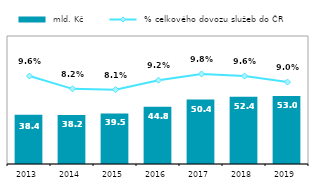
| Category |  mld. Kč |
|---|---|
| 2013.0 | 38.382 |
| 2014.0 | 38.232 |
| 2015.0 | 39.517 |
| 2016.0 | 44.807 |
| 2017.0 | 50.389 |
| 2018.0 | 52.446 |
| 2019.0 | 53.04 |